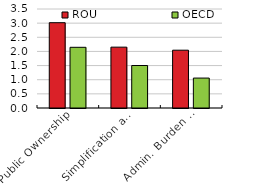
| Category | ROU | OECD |
|---|---|---|
| Public Ownership | 3.016 | 2.146 |
| Simplification and Evaluation of Regulations | 2.152 | 1.502 |
| Admin. Burden  on Start-ups  | 2.044 | 1.058 |